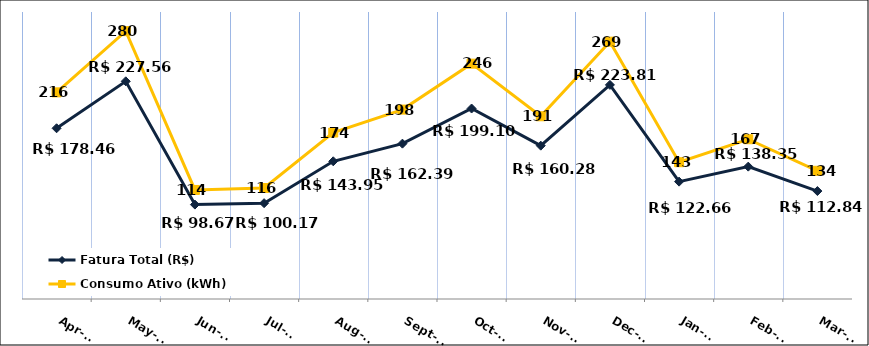
| Category | Fatura Total (R$) |
|---|---|
| 2023-04-01 | 178.46 |
| 2023-05-01 | 227.56 |
| 2023-06-01 | 98.67 |
| 2023-07-01 | 100.17 |
| 2023-08-01 | 143.95 |
| 2023-09-01 | 162.39 |
| 2023-10-01 | 199.1 |
| 2023-11-01 | 160.28 |
| 2023-12-01 | 223.81 |
| 2024-01-01 | 122.66 |
| 2024-02-01 | 138.35 |
| 2024-03-01 | 112.84 |